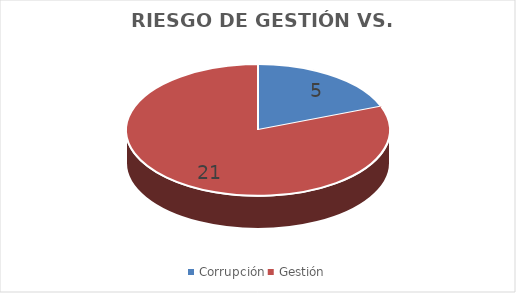
| Category | Series 0 |
|---|---|
| Corrupción | 5 |
| Gestión | 21 |